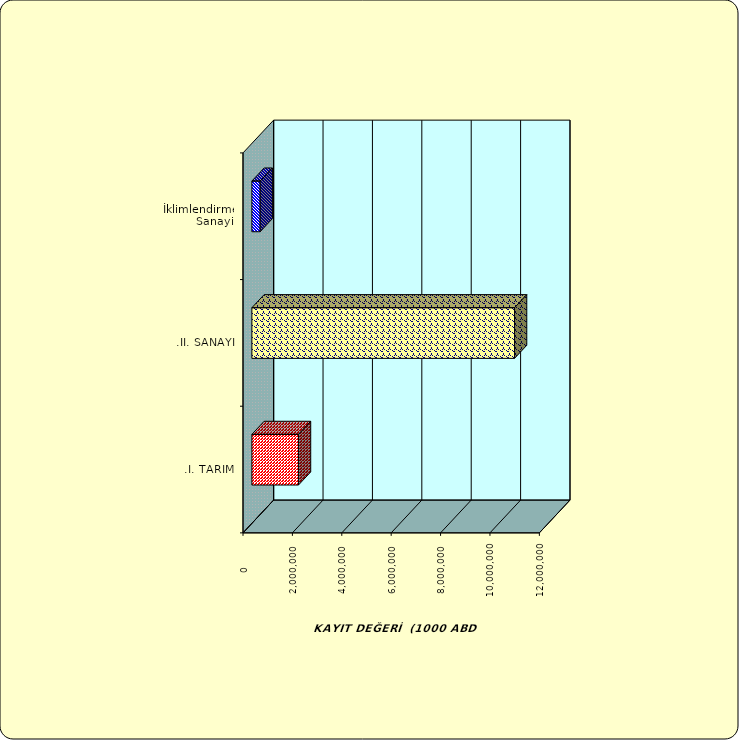
| Category | Series 0 |
|---|---|
| .I. TARIM | 1886703.998 |
| .II. SANAYİ | 10635320.68 |
|  İklimlendirme Sanayii | 335473.005 |